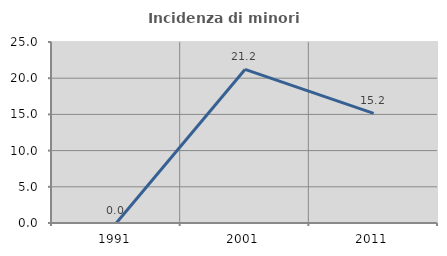
| Category | Incidenza di minori stranieri |
|---|---|
| 1991.0 | 0 |
| 2001.0 | 21.212 |
| 2011.0 | 15.152 |